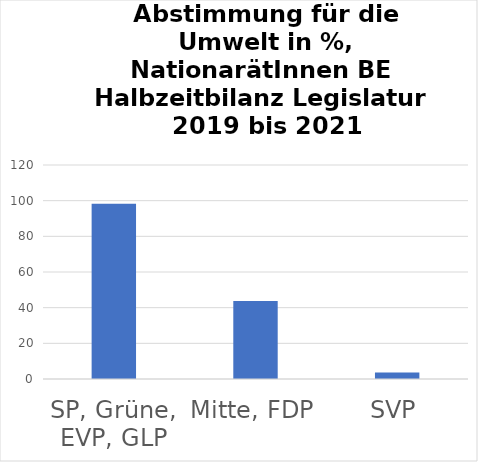
| Category | Series 0 |
|---|---|
| SP, Grüne, EVP, GLP | 98.292 |
| Mitte, FDP | 43.75 |
| SVP | 3.675 |